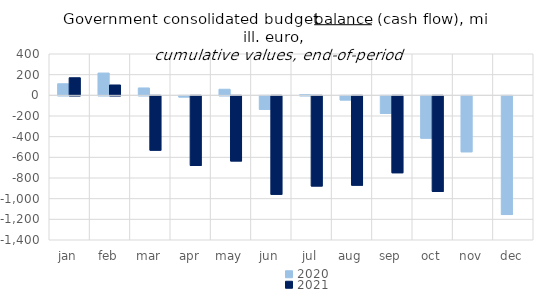
| Category | 2020 | 2021 |
|---|---|---|
| jan | 111895.871 | 170157.398 |
| feb | 215606.534 | 100119.496 |
| mar | 71313.478 | -526188.27 |
| apr | -11309.275 | -673998.575 |
| may | 58727.001 | -630296.539 |
| jun | -131386 | -953547.976 |
| jul | 6168.965 | -872897.27 |
| aug | -40154.809 | -864679.341 |
| sep | -170108.224 | -744219.279 |
| oct | -409895.677 | -924686.722 |
| nov | -541299.118 | 0 |
| dec | -1148893.835 | 0 |